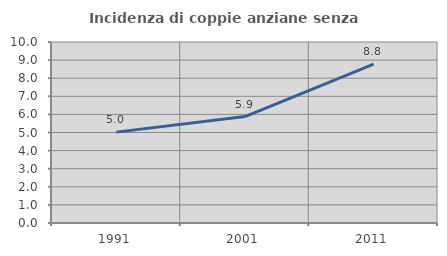
| Category | Incidenza di coppie anziane senza figli  |
|---|---|
| 1991.0 | 5.021 |
| 2001.0 | 5.882 |
| 2011.0 | 8.779 |